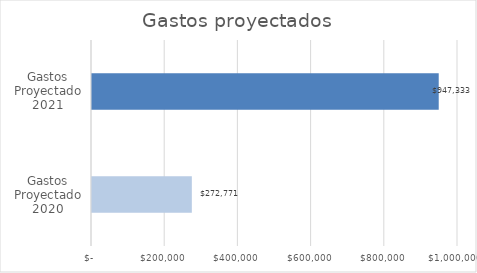
| Category | Series 0 |
|---|---|
| Gastos Proyectado 2020 | 272770.958 |
| Gastos Proyectado 2021 | 947333.078 |